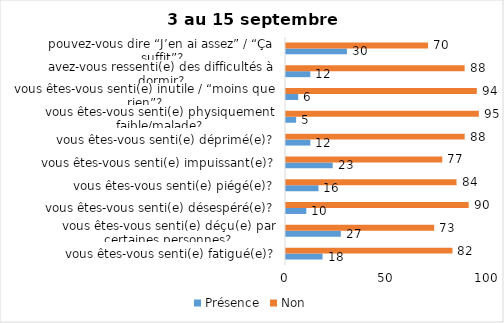
| Category | Présence | Non |
|---|---|---|
| vous êtes-vous senti(e) fatigué(e)? | 18 | 82 |
| vous êtes-vous senti(e) déçu(e) par certaines personnes? | 27 | 73 |
| vous êtes-vous senti(e) désespéré(e)? | 10 | 90 |
| vous êtes-vous senti(e) piégé(e)? | 16 | 84 |
| vous êtes-vous senti(e) impuissant(e)? | 23 | 77 |
| vous êtes-vous senti(e) déprimé(e)? | 12 | 88 |
| vous êtes-vous senti(e) physiquement faible/malade? | 5 | 95 |
| vous êtes-vous senti(e) inutile / “moins que rien”? | 6 | 94 |
| avez-vous ressenti(e) des difficultés à dormir? | 12 | 88 |
| pouvez-vous dire “J’en ai assez” / “Ça suffit”? | 30 | 70 |